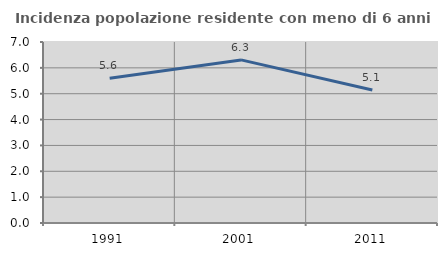
| Category | Incidenza popolazione residente con meno di 6 anni |
|---|---|
| 1991.0 | 5.599 |
| 2001.0 | 6.308 |
| 2011.0 | 5.141 |